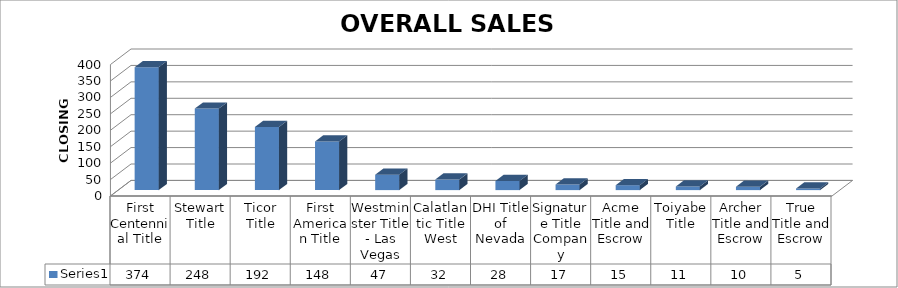
| Category | Series 0 |
|---|---|
| First Centennial Title | 374 |
| Stewart Title | 248 |
| Ticor Title | 192 |
| First American Title | 148 |
| Westminster Title - Las Vegas | 47 |
| Calatlantic Title West | 32 |
| DHI Title of Nevada | 28 |
| Signature Title Company | 17 |
| Acme Title and Escrow | 15 |
| Toiyabe Title | 11 |
| Archer Title and Escrow | 10 |
| True Title and Escrow | 5 |